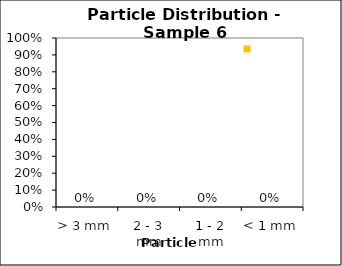
| Category | Series 1 |
|---|---|
| > 3 mm | 0 |
| 2 - 3 mm | 0 |
| 1 - 2 mm | 0 |
| < 1 mm | 0 |